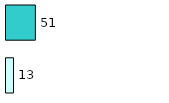
| Category | Series 0 | Series 1 |
|---|---|---|
| 0 | 13 | 51 |